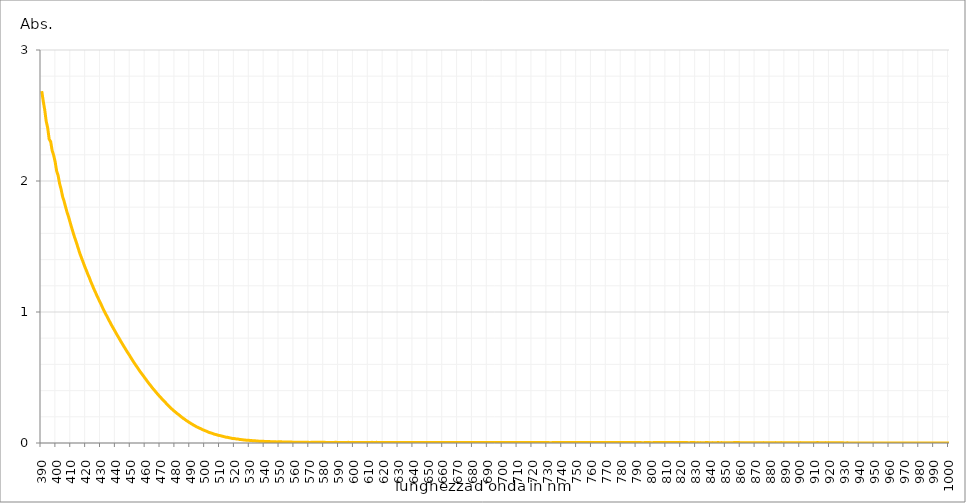
| Category | Series 0 |
|---|---|
| 390.0 | 2.686 |
| 391.0 | 2.61 |
| 392.0 | 2.544 |
| 393.0 | 2.456 |
| 394.0 | 2.405 |
| 395.0 | 2.319 |
| 396.0 | 2.301 |
| 397.0 | 2.232 |
| 398.0 | 2.197 |
| 399.0 | 2.147 |
| 400.0 | 2.077 |
| 401.0 | 2.042 |
| 402.0 | 1.98 |
| 403.0 | 1.938 |
| 404.0 | 1.882 |
| 405.0 | 1.846 |
| 406.0 | 1.803 |
| 407.0 | 1.762 |
| 408.0 | 1.728 |
| 409.0 | 1.687 |
| 410.0 | 1.648 |
| 411.0 | 1.61 |
| 412.0 | 1.573 |
| 413.0 | 1.54 |
| 414.0 | 1.505 |
| 415.0 | 1.469 |
| 416.0 | 1.435 |
| 417.0 | 1.405 |
| 418.0 | 1.375 |
| 419.0 | 1.344 |
| 420.0 | 1.317 |
| 421.0 | 1.287 |
| 422.0 | 1.262 |
| 423.0 | 1.231 |
| 424.0 | 1.205 |
| 425.0 | 1.177 |
| 426.0 | 1.153 |
| 427.0 | 1.127 |
| 428.0 | 1.103 |
| 429.0 | 1.079 |
| 430.0 | 1.056 |
| 431.0 | 1.03 |
| 432.0 | 1.007 |
| 433.0 | 0.984 |
| 434.0 | 0.964 |
| 435.0 | 0.94 |
| 436.0 | 0.92 |
| 437.0 | 0.898 |
| 438.0 | 0.878 |
| 439.0 | 0.858 |
| 440.0 | 0.838 |
| 441.0 | 0.818 |
| 442.0 | 0.799 |
| 443.0 | 0.779 |
| 444.0 | 0.76 |
| 445.0 | 0.741 |
| 446.0 | 0.723 |
| 447.0 | 0.704 |
| 448.0 | 0.686 |
| 449.0 | 0.669 |
| 450.0 | 0.65 |
| 451.0 | 0.632 |
| 452.0 | 0.614 |
| 453.0 | 0.597 |
| 454.0 | 0.581 |
| 455.0 | 0.564 |
| 456.0 | 0.547 |
| 457.0 | 0.532 |
| 458.0 | 0.517 |
| 459.0 | 0.501 |
| 460.0 | 0.486 |
| 461.0 | 0.47 |
| 462.0 | 0.455 |
| 463.0 | 0.441 |
| 464.0 | 0.426 |
| 465.0 | 0.412 |
| 466.0 | 0.399 |
| 467.0 | 0.385 |
| 468.0 | 0.372 |
| 469.0 | 0.359 |
| 470.0 | 0.347 |
| 471.0 | 0.334 |
| 472.0 | 0.322 |
| 473.0 | 0.311 |
| 474.0 | 0.298 |
| 475.0 | 0.286 |
| 476.0 | 0.275 |
| 477.0 | 0.264 |
| 478.0 | 0.254 |
| 479.0 | 0.244 |
| 480.0 | 0.235 |
| 481.0 | 0.225 |
| 482.0 | 0.217 |
| 483.0 | 0.207 |
| 484.0 | 0.198 |
| 485.0 | 0.189 |
| 486.0 | 0.182 |
| 487.0 | 0.173 |
| 488.0 | 0.166 |
| 489.0 | 0.158 |
| 490.0 | 0.151 |
| 491.0 | 0.144 |
| 492.0 | 0.137 |
| 493.0 | 0.131 |
| 494.0 | 0.124 |
| 495.0 | 0.119 |
| 496.0 | 0.113 |
| 497.0 | 0.109 |
| 498.0 | 0.102 |
| 499.0 | 0.098 |
| 500.0 | 0.093 |
| 501.0 | 0.089 |
| 502.0 | 0.083 |
| 503.0 | 0.079 |
| 504.0 | 0.076 |
| 505.0 | 0.072 |
| 506.0 | 0.067 |
| 507.0 | 0.065 |
| 508.0 | 0.061 |
| 509.0 | 0.058 |
| 510.0 | 0.056 |
| 511.0 | 0.053 |
| 512.0 | 0.05 |
| 513.0 | 0.047 |
| 514.0 | 0.044 |
| 515.0 | 0.043 |
| 516.0 | 0.04 |
| 517.0 | 0.038 |
| 518.0 | 0.035 |
| 519.0 | 0.034 |
| 520.0 | 0.033 |
| 521.0 | 0.03 |
| 522.0 | 0.03 |
| 523.0 | 0.027 |
| 524.0 | 0.026 |
| 525.0 | 0.025 |
| 526.0 | 0.023 |
| 527.0 | 0.022 |
| 528.0 | 0.021 |
| 529.0 | 0.021 |
| 530.0 | 0.019 |
| 531.0 | 0.019 |
| 532.0 | 0.017 |
| 533.0 | 0.017 |
| 534.0 | 0.016 |
| 535.0 | 0.015 |
| 536.0 | 0.014 |
| 537.0 | 0.014 |
| 538.0 | 0.013 |
| 539.0 | 0.013 |
| 540.0 | 0.012 |
| 541.0 | 0.011 |
| 542.0 | 0.011 |
| 543.0 | 0.011 |
| 544.0 | 0.01 |
| 545.0 | 0.009 |
| 546.0 | 0.01 |
| 547.0 | 0.01 |
| 548.0 | 0.008 |
| 549.0 | 0.009 |
| 550.0 | 0.009 |
| 551.0 | 0.009 |
| 552.0 | 0.008 |
| 553.0 | 0.008 |
| 554.0 | 0.007 |
| 555.0 | 0.007 |
| 556.0 | 0.007 |
| 557.0 | 0.007 |
| 558.0 | 0.007 |
| 559.0 | 0.006 |
| 560.0 | 0.006 |
| 561.0 | 0.006 |
| 562.0 | 0.005 |
| 563.0 | 0.006 |
| 564.0 | 0.006 |
| 565.0 | 0.006 |
| 566.0 | 0.006 |
| 567.0 | 0.005 |
| 568.0 | 0.005 |
| 569.0 | 0.006 |
| 570.0 | 0.004 |
| 571.0 | 0.005 |
| 572.0 | 0.005 |
| 573.0 | 0.005 |
| 574.0 | 0.005 |
| 575.0 | 0.005 |
| 576.0 | 0.005 |
| 577.0 | 0.005 |
| 578.0 | 0.005 |
| 579.0 | 0.005 |
| 580.0 | 0.006 |
| 581.0 | 0.004 |
| 582.0 | 0.004 |
| 583.0 | 0.004 |
| 584.0 | 0.004 |
| 585.0 | 0.004 |
| 586.0 | 0.004 |
| 587.0 | 0.005 |
| 588.0 | 0.005 |
| 589.0 | 0.004 |
| 590.0 | 0.004 |
| 591.0 | 0.004 |
| 592.0 | 0.004 |
| 593.0 | 0.004 |
| 594.0 | 0.004 |
| 595.0 | 0.004 |
| 596.0 | 0.005 |
| 597.0 | 0.004 |
| 598.0 | 0.004 |
| 599.0 | 0.004 |
| 600.0 | 0.004 |
| 601.0 | 0.004 |
| 602.0 | 0.004 |
| 603.0 | 0.003 |
| 604.0 | 0.004 |
| 605.0 | 0.004 |
| 606.0 | 0.004 |
| 607.0 | 0.004 |
| 608.0 | 0.004 |
| 609.0 | 0.004 |
| 610.0 | 0.004 |
| 611.0 | 0.004 |
| 612.0 | 0.005 |
| 613.0 | 0.004 |
| 614.0 | 0.004 |
| 615.0 | 0.005 |
| 616.0 | 0.004 |
| 617.0 | 0.004 |
| 618.0 | 0.004 |
| 619.0 | 0.003 |
| 620.0 | 0.004 |
| 621.0 | 0.004 |
| 622.0 | 0.004 |
| 623.0 | 0.004 |
| 624.0 | 0.004 |
| 625.0 | 0.004 |
| 626.0 | 0.004 |
| 627.0 | 0.003 |
| 628.0 | 0.004 |
| 629.0 | 0.004 |
| 630.0 | 0.004 |
| 631.0 | 0.004 |
| 632.0 | 0.004 |
| 633.0 | 0.004 |
| 634.0 | 0.004 |
| 635.0 | 0.004 |
| 636.0 | 0.004 |
| 637.0 | 0.003 |
| 638.0 | 0.004 |
| 639.0 | 0.004 |
| 640.0 | 0.004 |
| 641.0 | 0.004 |
| 642.0 | 0.004 |
| 643.0 | 0.004 |
| 644.0 | 0.004 |
| 645.0 | 0.004 |
| 646.0 | 0.003 |
| 647.0 | 0.004 |
| 648.0 | 0.004 |
| 649.0 | 0.004 |
| 650.0 | 0.004 |
| 651.0 | 0.004 |
| 652.0 | 0.004 |
| 653.0 | 0.003 |
| 654.0 | 0.004 |
| 655.0 | 0.004 |
| 656.0 | 0.004 |
| 657.0 | 0.003 |
| 658.0 | 0.004 |
| 659.0 | 0.004 |
| 660.0 | 0.004 |
| 661.0 | 0.004 |
| 662.0 | 0.003 |
| 663.0 | 0.004 |
| 664.0 | 0.004 |
| 665.0 | 0.004 |
| 666.0 | 0.004 |
| 667.0 | 0.004 |
| 668.0 | 0.003 |
| 669.0 | 0.004 |
| 670.0 | 0.004 |
| 671.0 | 0.004 |
| 672.0 | 0.004 |
| 673.0 | 0.003 |
| 674.0 | 0.004 |
| 675.0 | 0.004 |
| 676.0 | 0.004 |
| 677.0 | 0.004 |
| 678.0 | 0.004 |
| 679.0 | 0.004 |
| 680.0 | 0.004 |
| 681.0 | 0.003 |
| 682.0 | 0.004 |
| 683.0 | 0.003 |
| 684.0 | 0.004 |
| 685.0 | 0.003 |
| 686.0 | 0.003 |
| 687.0 | 0.004 |
| 688.0 | 0.003 |
| 689.0 | 0.004 |
| 690.0 | 0.004 |
| 691.0 | 0.004 |
| 692.0 | 0.004 |
| 693.0 | 0.004 |
| 694.0 | 0.004 |
| 695.0 | 0.004 |
| 696.0 | 0.003 |
| 697.0 | 0.004 |
| 698.0 | 0.004 |
| 699.0 | 0.004 |
| 700.0 | 0.004 |
| 701.0 | 0.003 |
| 702.0 | 0.003 |
| 703.0 | 0.003 |
| 704.0 | 0.003 |
| 705.0 | 0.004 |
| 706.0 | 0.004 |
| 707.0 | 0.003 |
| 708.0 | 0.003 |
| 709.0 | 0.003 |
| 710.0 | 0.003 |
| 711.0 | 0.003 |
| 712.0 | 0.003 |
| 713.0 | 0.003 |
| 714.0 | 0.004 |
| 715.0 | 0.003 |
| 716.0 | 0.003 |
| 717.0 | 0.004 |
| 718.0 | 0.003 |
| 719.0 | 0.003 |
| 720.0 | 0.003 |
| 721.0 | 0.004 |
| 722.0 | 0.004 |
| 723.0 | 0.003 |
| 724.0 | 0.004 |
| 725.0 | 0.003 |
| 726.0 | 0.003 |
| 727.0 | 0.003 |
| 728.0 | 0.003 |
| 729.0 | 0.003 |
| 730.0 | 0.003 |
| 731.0 | 0.003 |
| 732.0 | 0.002 |
| 733.0 | 0.003 |
| 734.0 | 0.003 |
| 735.0 | 0.003 |
| 736.0 | 0.003 |
| 737.0 | 0.003 |
| 738.0 | 0.003 |
| 739.0 | 0.003 |
| 740.0 | 0.003 |
| 741.0 | 0.003 |
| 742.0 | 0.003 |
| 743.0 | 0.003 |
| 744.0 | 0.003 |
| 745.0 | 0.003 |
| 746.0 | 0.003 |
| 747.0 | 0.003 |
| 748.0 | 0.003 |
| 749.0 | 0.003 |
| 750.0 | 0.003 |
| 751.0 | 0.003 |
| 752.0 | 0.003 |
| 753.0 | 0.003 |
| 754.0 | 0.003 |
| 755.0 | 0.003 |
| 756.0 | 0.003 |
| 757.0 | 0.004 |
| 758.0 | 0.003 |
| 759.0 | 0.003 |
| 760.0 | 0.003 |
| 761.0 | 0.003 |
| 762.0 | 0.003 |
| 763.0 | 0.004 |
| 764.0 | 0.003 |
| 765.0 | 0.003 |
| 766.0 | 0.003 |
| 767.0 | 0.003 |
| 768.0 | 0.003 |
| 769.0 | 0.003 |
| 770.0 | 0.003 |
| 771.0 | 0.003 |
| 772.0 | 0.003 |
| 773.0 | 0.003 |
| 774.0 | 0.003 |
| 775.0 | 0.003 |
| 776.0 | 0.003 |
| 777.0 | 0.003 |
| 778.0 | 0.003 |
| 779.0 | 0.003 |
| 780.0 | 0.003 |
| 781.0 | 0.003 |
| 782.0 | 0.003 |
| 783.0 | 0.003 |
| 784.0 | 0.003 |
| 785.0 | 0.003 |
| 786.0 | 0.003 |
| 787.0 | 0.003 |
| 788.0 | 0.004 |
| 789.0 | 0.003 |
| 790.0 | 0.003 |
| 791.0 | 0.003 |
| 792.0 | 0.003 |
| 793.0 | 0.003 |
| 794.0 | 0.002 |
| 795.0 | 0.003 |
| 796.0 | 0.003 |
| 797.0 | 0.003 |
| 798.0 | 0.003 |
| 799.0 | 0.003 |
| 800.0 | 0.002 |
| 801.0 | 0.003 |
| 802.0 | 0.003 |
| 803.0 | 0.003 |
| 804.0 | 0.003 |
| 805.0 | 0.003 |
| 806.0 | 0.004 |
| 807.0 | 0.003 |
| 808.0 | 0.003 |
| 809.0 | 0.003 |
| 810.0 | 0.003 |
| 811.0 | 0.003 |
| 812.0 | 0.003 |
| 813.0 | 0.003 |
| 814.0 | 0.003 |
| 815.0 | 0.003 |
| 816.0 | 0.003 |
| 817.0 | 0.003 |
| 818.0 | 0.003 |
| 819.0 | 0.003 |
| 820.0 | 0.003 |
| 821.0 | 0.003 |
| 822.0 | 0.003 |
| 823.0 | 0.003 |
| 824.0 | 0.003 |
| 825.0 | 0.002 |
| 826.0 | 0.003 |
| 827.0 | 0.003 |
| 828.0 | 0.003 |
| 829.0 | 0.003 |
| 830.0 | 0.002 |
| 831.0 | 0.003 |
| 832.0 | 0.002 |
| 833.0 | 0.003 |
| 834.0 | 0.002 |
| 835.0 | 0.002 |
| 836.0 | 0.003 |
| 837.0 | 0.003 |
| 838.0 | 0.003 |
| 839.0 | 0.002 |
| 840.0 | 0.002 |
| 841.0 | 0.003 |
| 842.0 | 0.002 |
| 843.0 | 0.002 |
| 844.0 | 0.003 |
| 845.0 | 0.003 |
| 846.0 | 0.002 |
| 847.0 | 0.003 |
| 848.0 | 0.002 |
| 849.0 | 0.002 |
| 850.0 | 0.002 |
| 851.0 | 0.002 |
| 852.0 | 0.002 |
| 853.0 | 0.002 |
| 854.0 | 0.002 |
| 855.0 | 0.003 |
| 856.0 | 0.003 |
| 857.0 | 0.003 |
| 858.0 | 0.003 |
| 859.0 | 0.003 |
| 860.0 | 0.002 |
| 861.0 | 0.002 |
| 862.0 | 0.002 |
| 863.0 | 0.002 |
| 864.0 | 0.002 |
| 865.0 | 0.001 |
| 866.0 | 0.002 |
| 867.0 | 0.002 |
| 868.0 | 0.002 |
| 869.0 | 0.002 |
| 870.0 | 0.001 |
| 871.0 | 0.002 |
| 872.0 | 0.002 |
| 873.0 | 0.002 |
| 874.0 | 0.002 |
| 875.0 | 0.003 |
| 876.0 | 0.002 |
| 877.0 | 0.002 |
| 878.0 | 0.002 |
| 879.0 | 0.002 |
| 880.0 | 0.002 |
| 881.0 | 0.002 |
| 882.0 | 0.001 |
| 883.0 | 0.003 |
| 884.0 | 0.001 |
| 885.0 | 0.002 |
| 886.0 | 0.002 |
| 887.0 | 0.003 |
| 888.0 | 0.002 |
| 889.0 | 0.002 |
| 890.0 | 0.002 |
| 891.0 | 0.002 |
| 892.0 | 0.002 |
| 893.0 | 0.002 |
| 894.0 | 0.002 |
| 895.0 | 0.002 |
| 896.0 | 0.002 |
| 897.0 | 0.002 |
| 898.0 | 0.002 |
| 899.0 | 0.002 |
| 900.0 | 0.003 |
| 901.0 | 0.001 |
| 902.0 | 0.002 |
| 903.0 | 0.002 |
| 904.0 | 0.002 |
| 905.0 | 0.002 |
| 906.0 | 0.002 |
| 907.0 | 0.002 |
| 908.0 | 0.002 |
| 909.0 | 0.002 |
| 910.0 | 0.002 |
| 911.0 | 0.003 |
| 912.0 | 0.003 |
| 913.0 | 0.002 |
| 914.0 | 0.002 |
| 915.0 | 0.002 |
| 916.0 | 0.002 |
| 917.0 | 0.003 |
| 918.0 | 0.002 |
| 919.0 | 0.003 |
| 920.0 | 0.002 |
| 921.0 | 0.001 |
| 922.0 | 0.001 |
| 923.0 | 0.001 |
| 924.0 | 0.001 |
| 925.0 | 0.001 |
| 926.0 | 0.002 |
| 927.0 | 0.001 |
| 928.0 | 0.002 |
| 929.0 | 0.001 |
| 930.0 | 0 |
| 931.0 | 0.001 |
| 932.0 | 0.001 |
| 933.0 | 0 |
| 934.0 | 0 |
| 935.0 | 0 |
| 936.0 | 0 |
| 937.0 | 0 |
| 938.0 | 0 |
| 939.0 | 0 |
| 940.0 | 0 |
| 941.0 | 0 |
| 942.0 | 0 |
| 943.0 | 0 |
| 944.0 | 0 |
| 945.0 | 0 |
| 946.0 | 0 |
| 947.0 | 0 |
| 948.0 | 0 |
| 949.0 | 0 |
| 950.0 | 0 |
| 951.0 | 0 |
| 952.0 | 0 |
| 953.0 | 0 |
| 954.0 | 0 |
| 955.0 | 0 |
| 956.0 | 0 |
| 957.0 | 0 |
| 958.0 | 0 |
| 959.0 | 0 |
| 960.0 | 0 |
| 961.0 | 0 |
| 962.0 | 0 |
| 963.0 | 0 |
| 964.0 | 0 |
| 965.0 | 0 |
| 966.0 | 0 |
| 967.0 | 0 |
| 968.0 | 0 |
| 969.0 | 0 |
| 970.0 | 0 |
| 971.0 | 0 |
| 972.0 | 0 |
| 973.0 | 0 |
| 974.0 | 0 |
| 975.0 | 0 |
| 976.0 | 0 |
| 977.0 | 0 |
| 978.0 | 0 |
| 979.0 | 0 |
| 980.0 | 0 |
| 981.0 | 0 |
| 982.0 | 0 |
| 983.0 | 0 |
| 984.0 | 0 |
| 985.0 | 0 |
| 986.0 | 0 |
| 987.0 | 0 |
| 988.0 | 0 |
| 989.0 | 0 |
| 990.0 | 0 |
| 991.0 | 0 |
| 992.0 | 0 |
| 993.0 | 0 |
| 994.0 | 0 |
| 995.0 | 0 |
| 996.0 | 0 |
| 997.0 | 0 |
| 998.0 | 0 |
| 999.0 | 0 |
| 1000.0 | 0 |